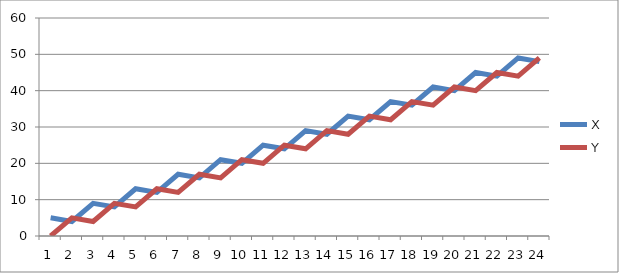
| Category | X | Y |
|---|---|---|
| 0 | 5 | 0 |
| 1 | 4 | 5 |
| 2 | 9 | 4 |
| 3 | 8 | 9 |
| 4 | 13 | 8 |
| 5 | 12 | 13 |
| 6 | 17 | 12 |
| 7 | 16 | 17 |
| 8 | 21 | 16 |
| 9 | 20 | 21 |
| 10 | 25 | 20 |
| 11 | 24 | 25 |
| 12 | 29 | 24 |
| 13 | 28 | 29 |
| 14 | 33 | 28 |
| 15 | 32 | 33 |
| 16 | 37 | 32 |
| 17 | 36 | 37 |
| 18 | 41 | 36 |
| 19 | 40 | 41 |
| 20 | 45 | 40 |
| 21 | 44 | 45 |
| 22 | 49 | 44 |
| 23 | 48 | 49 |